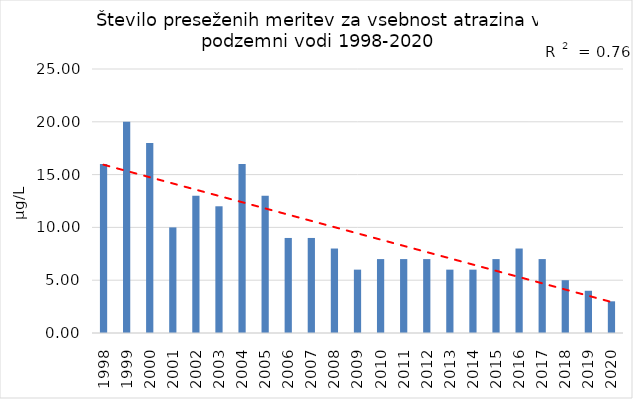
| Category | Series 0 |
|---|---|
| 1998.0 | 16 |
| 1999.0 | 20 |
| 2000.0 | 18 |
| 2001.0 | 10 |
| 2002.0 | 13 |
| 2003.0 | 12 |
| 2004.0 | 16 |
| 2005.0 | 13 |
| 2006.0 | 9 |
| 2007.0 | 9 |
| 2008.0 | 8 |
| 2009.0 | 6 |
| 2010.0 | 7 |
| 2011.0 | 7 |
| 2012.0 | 7 |
| 2013.0 | 6 |
| 2014.0 | 6 |
| 2015.0 | 7 |
| 2016.0 | 8 |
| 2017.0 | 7 |
| 2018.0 | 5 |
| 2019.0 | 4 |
| 2020.0 | 3 |